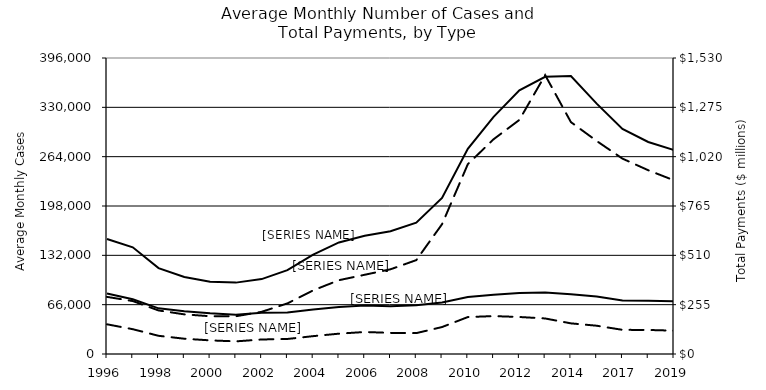
| Category | NPA Cases | PA Cases |
|---|---|---|
| 1996.0 | 153788 | 81065 |
| 1997.0 | 142711 | 73160 |
| 1998.0 | 114955 | 61089 |
| 1999.0 | 102943 | 57204 |
| 2000.0 | 96702 | 54525 |
| 2001.0 | 95498 | 52623 |
| 2002.0 | 100190 | 55203 |
| 2003.0 | 112186 | 55685 |
| 2004.0 | 132998 | 59441 |
| 2005.0 | 149282 | 62810 |
| 2006.0 | 158173 | 64944 |
| 2007.0 | 164340 | 63776 |
| 2008.0 | 175623 | 65207 |
| 2009.0 | 208735 | 68767 |
| 2010.0 | 274384 | 76215 |
| 2011.0 | 317312.083 | 79301.167 |
| 2012.0 | 352637.25 | 81586 |
| 2013.0 | 370809.917 | 82434.25 |
| 2014.0 | 371801.667 | 79838.667 |
| 2015.0 | 334929.333 | 76838.583 |
| 2017.0 | 301164.917 | 71640.25 |
| 2018.0 | 283686 | 71097 |
| 2019.0 | 272912.25 | 70504.667 |